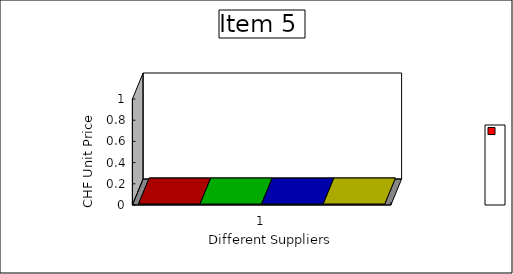
| Category | Series 0 | Supplier 3 | Supplier 2 | Supplier 1 |
|---|---|---|---|---|
| 0 | 0 | 0 | 0 | 0 |